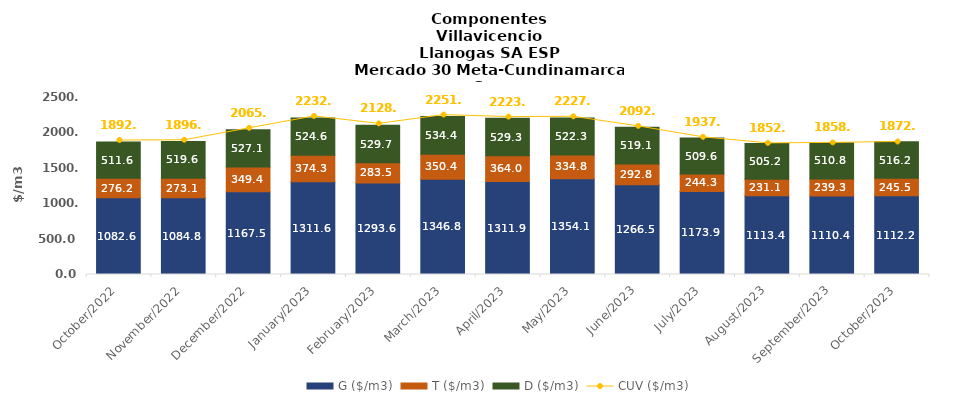
| Category | G ($/m3) | T ($/m3) | D ($/m3) |
|---|---|---|---|
| 2022-10-01 | 1082.55 | 276.23 | 511.58 |
| 2022-11-01 | 1084.79 | 273.13 | 519.57 |
| 2022-12-01 | 1167.54 | 349.4 | 527.09 |
| 2023-01-01 | 1311.57 | 374.33 | 524.58 |
| 2023-02-01 | 1293.59 | 283.45 | 529.74 |
| 2023-03-01 | 1346.83 | 350.38 | 534.44 |
| 2023-04-01 | 1311.89 | 364.02 | 529.26 |
| 2023-05-01 | 1354.14 | 334.83 | 522.32 |
| 2023-06-01 | 1266.52 | 292.77 | 519.06 |
| 2023-07-01 | 1173.91 | 244.29 | 509.62 |
| 2023-08-01 | 1113.38 | 231.11 | 505.17 |
| 2023-09-01 | 1110.42 | 239.27 | 510.83 |
| 2023-10-01 | 1112.24 | 245.53 | 516.22 |